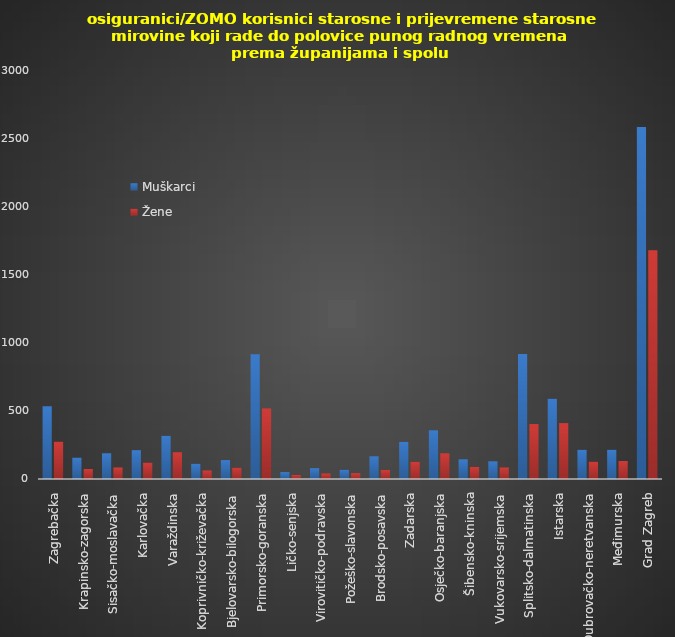
| Category | Muškarci | Žene |
|---|---|---|
| Zagrebačka | 535 | 275 |
| Krapinsko-zagorska | 158 | 74 |
| Sisačko-moslavačka | 189 | 85 |
| Karlovačka | 212 | 121 |
| Varaždinska | 318 | 197 |
| Koprivničko-križevačka | 112 | 63 |
| Bjelovarsko-bilogorska | 139 | 84 |
| Primorsko-goranska | 918 | 519 |
| Ličko-senjska | 51 | 30 |
| Virovitičko-podravska | 80 | 41 |
| Požeško-slavonska | 68 | 43 |
| Brodsko-posavska | 167 | 67 |
| Zadarska | 273 | 127 |
| Osječko-baranjska | 358 | 189 |
| Šibensko-kninska | 145 | 89 |
| Vukovarsko-srijemska | 130 | 85 |
| Splitsko-dalmatinska | 919 | 404 |
| Istarska | 590 | 411 |
| Dubrovačko-neretvanska | 215 | 127 |
| Međimurska | 215 | 132 |
| Grad Zagreb | 2589 | 1682 |